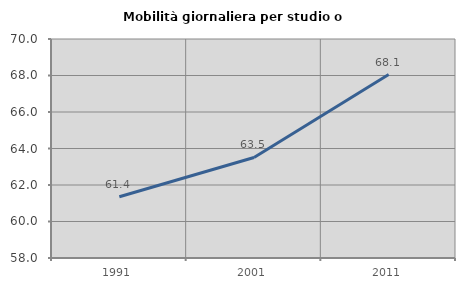
| Category | Mobilità giornaliera per studio o lavoro |
|---|---|
| 1991.0 | 61.357 |
| 2001.0 | 63.51 |
| 2011.0 | 68.054 |